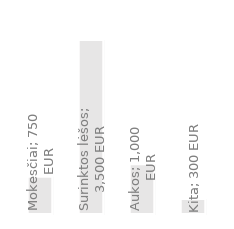
| Category | Metinės pajamos |
|---|---|
| Mokesčiai | 750 |
| Surinktos lėšos | 3500 |
| Aukos | 1000 |
| Kita | 300 |